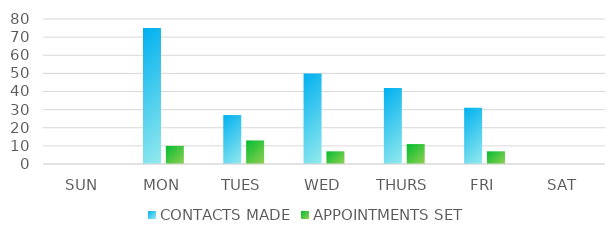
| Category | CONTACTS MADE | APPOINTMENTS SET |
|---|---|---|
| SUN | 0 | 0 |
| MON | 75 | 10 |
| TUES | 27 | 13 |
| WED | 50 | 7 |
| THURS | 42 | 11 |
| FRI | 31 | 7 |
| SAT | 0 | 0 |